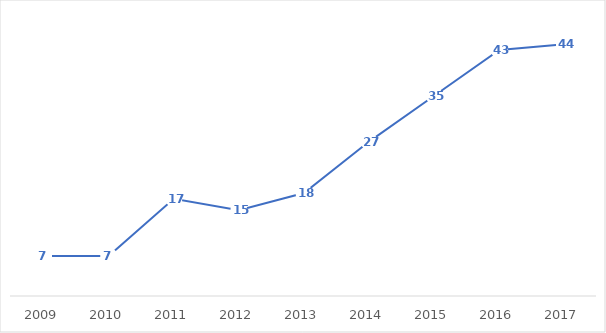
| Category | Número publicaciones |
|---|---|
| 2009.0 | 7 |
| 2010.0 | 7 |
| 2011.0 | 17 |
| 2012.0 | 15 |
| 2013.0 | 18 |
| 2014.0 | 27 |
| 2015.0 | 35 |
| 2016.0 | 43 |
| 2017.0 | 44 |